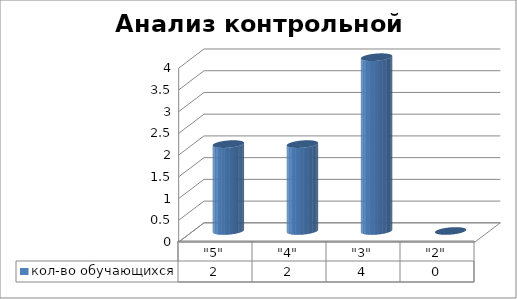
| Category | кол-во обучающихся |
|---|---|
| "5" | 2 |
| "4" | 2 |
| "3" | 4 |
| "2" | 0 |